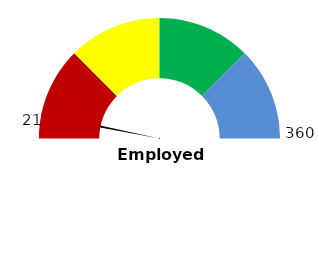
| Category | Series 1 |
|---|---|
| 0 | 5.833 |
| 1 | 1 |
| 2 | 193.167 |